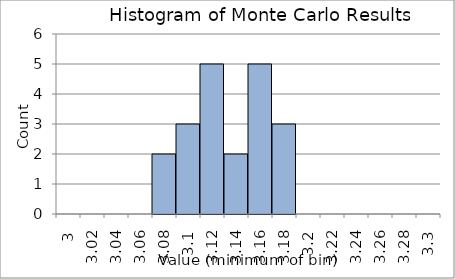
| Category | Series 0 |
|---|---|
| 3.0 | 0 |
| 3.02 | 0 |
| 3.04 | 0 |
| 3.06 | 0 |
| 3.08 | 2 |
| 3.1 | 3 |
| 3.12 | 5 |
| 3.14 | 2 |
| 3.16 | 5 |
| 3.18 | 3 |
| 3.2 | 0 |
| 3.22 | 0 |
| 3.24 | 0 |
| 3.2600000000000002 | 0 |
| 3.2800000000000002 | 0 |
| 3.3000000000000003 | 0 |